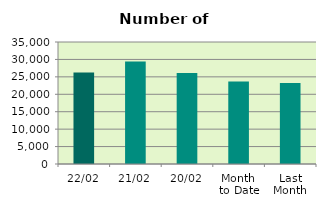
| Category | Series 0 |
|---|---|
| 22/02 | 26278 |
| 21/02 | 29410 |
| 20/02 | 26098 |
| Month 
to Date | 23633.125 |
| Last
Month | 23217.273 |